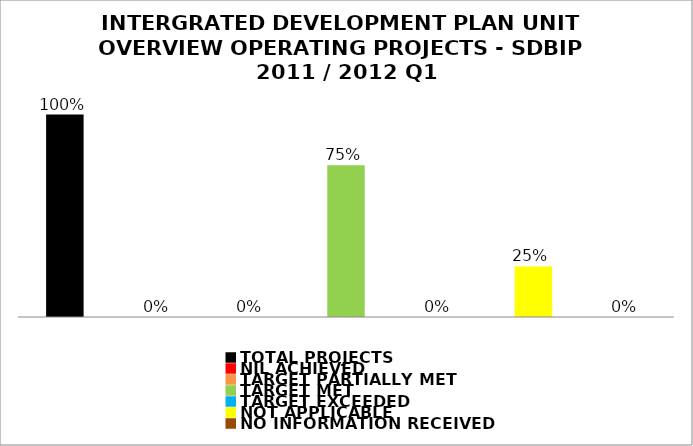
| Category | Series 0 |
|---|---|
| TOTAL PROJECTS | 1 |
| NIL ACHIEVED | 0 |
| TARGET PARTIALLY MET | 0 |
| TARGET MET | 0.75 |
| TARGET EXCEEDED | 0 |
| NOT APPLICABLE | 0.25 |
| NO INFORMATION RECEIVED | 0 |